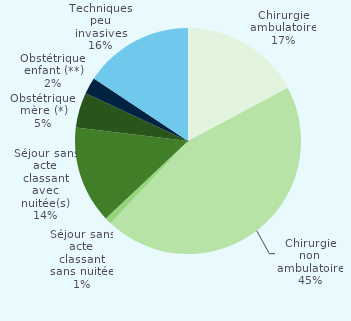
| Category | Series 0 |
|---|---|
| Chirurgie ambulatoire | 0.172 |
| Chirurgie non ambulatoire | 0.448 |
| Séjour sans acte classant sans nuitée | 0.01 |
| Séjour sans acte classant avec nuitée(s) | 0.139 |
| Obstétrique mère (*) | 0.051 |
| Obstétrique enfant (**) | 0.024 |
| Techniques peu invasives | 0.157 |